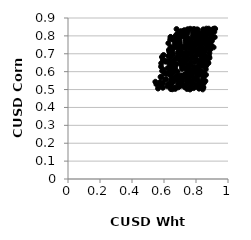
| Category | Series 0 |
|---|---|
| 0.8606674296195633 | 0.79 |
| 0.6999348493348481 | 0.739 |
| 0.7616677487825909 | 0.515 |
| 0.8411690088886075 | 0.803 |
| 0.8267198958037669 | 0.755 |
| 0.6464275884863512 | 0.652 |
| 0.6991743480333439 | 0.717 |
| 0.9055763534838281 | 0.791 |
| 0.6305321046207775 | 0.598 |
| 0.7493462155051412 | 0.692 |
| 0.7926615514258134 | 0.672 |
| 0.8619842693842257 | 0.634 |
| 0.8018020450109519 | 0.713 |
| 0.7681431878229723 | 0.595 |
| 0.7435577358216263 | 0.784 |
| 0.7680098271674152 | 0.583 |
| 0.8462123624348579 | 0.667 |
| 0.7551497769042917 | 0.541 |
| 0.8528021611921892 | 0.782 |
| 0.7980126099627312 | 0.597 |
| 0.7474657759232011 | 0.569 |
| 0.8227832912499451 | 0.809 |
| 0.7874615999468071 | 0.683 |
| 0.6772578194846646 | 0.576 |
| 0.8738030863500944 | 0.751 |
| 0.8219093014470423 | 0.516 |
| 0.7866721516052269 | 0.626 |
| 0.6597053665394986 | 0.649 |
| 0.6516592689620344 | 0.65 |
| 0.7657209606896632 | 0.644 |
| 0.8024218543053964 | 0.834 |
| 0.8706550780828108 | 0.741 |
| 0.669074520028345 | 0.622 |
| 0.8646617876156557 | 0.796 |
| 0.7603945457837402 | 0.754 |
| 0.6247156605005162 | 0.659 |
| 0.8823604310153959 | 0.808 |
| 0.6760753035382701 | 0.8 |
| 0.7093660823693577 | 0.579 |
| 0.8226724688563778 | 0.79 |
| 0.7941110131641931 | 0.617 |
| 0.7574359576495027 | 0.697 |
| 0.828742201009635 | 0.811 |
| 0.7875686067217196 | 0.559 |
| 0.7559894152250648 | 0.673 |
| 0.7127020296447344 | 0.636 |
| 0.8891551870113985 | 0.802 |
| 0.762055454840781 | 0.702 |
| 0.8590485811385213 | 0.683 |
| 0.7184461397085107 | 0.826 |
| 0.863336542518994 | 0.727 |
| 0.7287862776569984 | 0.584 |
| 0.7763459543036225 | 0.548 |
| 0.8511013413340252 | 0.591 |
| 0.7853879393883064 | 0.508 |
| 0.7261053649565652 | 0.521 |
| 0.8073128500880817 | 0.559 |
| 0.7706152322490856 | 0.727 |
| 0.8549010762931147 | 0.825 |
| 0.8164788701928894 | 0.641 |
| 0.7282324067350684 | 0.74 |
| 0.8453413548928314 | 0.82 |
| 0.7408618150149606 | 0.575 |
| 0.5826546042844745 | 0.647 |
| 0.5849590476056439 | 0.526 |
| 0.834208086383052 | 0.688 |
| 0.8829216560381401 | 0.778 |
| 0.7619245457397941 | 0.772 |
| 0.7424667995521614 | 0.786 |
| 0.63430194592752 | 0.658 |
| 0.8665952181532147 | 0.761 |
| 0.6363046175230376 | 0.623 |
| 0.8123294542023353 | 0.773 |
| 0.6272517796509438 | 0.759 |
| 0.7303868740352525 | 0.645 |
| 0.747805615586763 | 0.629 |
| 0.7387196085404604 | 0.748 |
| 0.8531141233221653 | 0.796 |
| 0.7000441003576795 | 0.52 |
| 0.7357308003392908 | 0.566 |
| 0.6686884077655872 | 0.509 |
| 0.886459890604691 | 0.788 |
| 0.7967532162745362 | 0.567 |
| 0.713061950828129 | 0.561 |
| 0.8450386710320554 | 0.572 |
| 0.650107749832884 | 0.568 |
| 0.8830811718809208 | 0.832 |
| 0.6908439687992156 | 0.577 |
| 0.7494634234757541 | 0.625 |
| 0.7966015069082593 | 0.715 |
| 0.6525941603431751 | 0.502 |
| 0.8988485349186075 | 0.771 |
| 0.7642685110995725 | 0.757 |
| 0.8048900127626286 | 0.835 |
| 0.7773979851258961 | 0.586 |
| 0.9141915747024514 | 0.822 |
| 0.6805559746553618 | 0.642 |
| 0.7753563499236906 | 0.724 |
| 0.7313395420374461 | 0.679 |
| 0.7403778849098179 | 0.733 |
| 0.6369871910606489 | 0.523 |
| 0.794139560420247 | 0.676 |
| 0.5459135540867835 | 0.543 |
| 0.8891057101044171 | 0.758 |
| 0.8570862290025462 | 0.714 |
| 0.8404834262172327 | 0.63 |
| 0.8190058497395645 | 0.79 |
| 0.7832564238110448 | 0.725 |
| 0.7670144380952288 | 0.636 |
| 0.6049131091752462 | 0.556 |
| 0.8841599138822888 | 0.677 |
| 0.769766131755828 | 0.763 |
| 0.7914323824373495 | 0.836 |
| 0.8394290192869471 | 0.719 |
| 0.900254879935451 | 0.783 |
| 0.7705790342479129 | 0.574 |
| 0.5785080369647733 | 0.522 |
| 0.7730563596486816 | 0.744 |
| 0.7109604963369003 | 0.569 |
| 0.7114264282506166 | 0.523 |
| 0.7945318887647026 | 0.606 |
| 0.7047854540880232 | 0.826 |
| 0.7987490666397192 | 0.555 |
| 0.657621811892098 | 0.697 |
| 0.7972365121890362 | 0.757 |
| 0.8160670857000676 | 0.799 |
| 0.8172476007302536 | 0.72 |
| 0.8645980398335521 | 0.827 |
| 0.6465674440631175 | 0.643 |
| 0.6473330996554859 | 0.639 |
| 0.69388869733561 | 0.763 |
| 0.822845698345114 | 0.734 |
| 0.6835287564256733 | 0.553 |
| 0.7262040441602107 | 0.828 |
| 0.7393463433897386 | 0.709 |
| 0.7431892750957874 | 0.82 |
| 0.7576750658893622 | 0.64 |
| 0.8205171400303991 | 0.703 |
| 0.8955819652153647 | 0.747 |
| 0.8456059353965881 | 0.758 |
| 0.8621538082955802 | 0.751 |
| 0.8574976041245859 | 0.637 |
| 0.7011321767333416 | 0.717 |
| 0.727032698446707 | 0.794 |
| 0.8115324630853016 | 0.715 |
| 0.7130231030299599 | 0.615 |
| 0.9100789554782126 | 0.736 |
| 0.8610060682945005 | 0.613 |
| 0.6461637803023965 | 0.53 |
| 0.5815749823376429 | 0.628 |
| 0.7684164012723802 | 0.61 |
| 0.57873007427408 | 0.571 |
| 0.6897111563245267 | 0.513 |
| 0.791592401936394 | 0.718 |
| 0.6381668285140478 | 0.645 |
| 0.7902167455943879 | 0.678 |
| 0.8214099296545454 | 0.789 |
| 0.841845915618669 | 0.501 |
| 0.8655235738521514 | 0.766 |
| 0.8470280653277532 | 0.8 |
| 0.6705704897241429 | 0.504 |
| 0.7714581741482851 | 0.776 |
| 0.6950713011940342 | 0.698 |
| 0.7634400294237285 | 0.777 |
| 0.8624804471045378 | 0.582 |
| 0.552539735679884 | 0.529 |
| 0.6047432097485013 | 0.662 |
| 0.8455813681659083 | 0.837 |
| 0.643227611150495 | 0.55 |
| 0.8653294060950341 | 0.84 |
| 0.7461143308959663 | 0.83 |
| 0.7656652444362569 | 0.728 |
| 0.846718511545769 | 0.705 |
| 0.7617597047274746 | 0.588 |
| 0.7111814085209395 | 0.815 |
| 0.8520275885324056 | 0.785 |
| 0.7711167658126614 | 0.54 |
| 0.6589163452898665 | 0.661 |
| 0.8876979161435098 | 0.723 |
| 0.7415588676593998 | 0.662 |
| 0.638925142293215 | 0.78 |
| 0.842803687995572 | 0.671 |
| 0.5927702129927285 | 0.51 |
| 0.8888104122212008 | 0.769 |
| 0.7506243877987404 | 0.762 |
| 0.8258061881006242 | 0.638 |
| 0.7126045932211109 | 0.551 |
| 0.8164320188498746 | 0.627 |
| 0.8816331317544839 | 0.767 |
| 0.7605180500470761 | 0.73 |
| 0.7689107483400326 | 0.605 |
| 0.5840231444493837 | 0.57 |
| 0.6778154042169096 | 0.572 |
| 0.7299447843663049 | 0.513 |
| 0.7433305532417129 | 0.581 |
| 0.6364237006245839 | 0.638 |
| 0.6215099641155544 | 0.619 |
| 0.6720542953454912 | 0.783 |
| 0.7782598846361921 | 0.799 |
| 0.8689872887404752 | 0.813 |
| 0.6974467133722992 | 0.765 |
| 0.6394360754973103 | 0.607 |
| 0.8635625449101264 | 0.75 |
| 0.810560085752624 | 0.612 |
| 0.8016937719703552 | 0.517 |
| 0.6568893812398542 | 0.542 |
| 0.7407771515292378 | 0.624 |
| 0.5760868745589425 | 0.542 |
| 0.8873434219742073 | 0.726 |
| 0.6512638997739032 | 0.712 |
| 0.6652056943328782 | 0.508 |
| 0.6767092164983124 | 0.768 |
| 0.8756846499300529 | 0.65 |
| 0.8209297307973322 | 0.599 |
| 0.8008426721371884 | 0.696 |
| 0.8641630802995725 | 0.825 |
| 0.771986340988601 | 0.51 |
| 0.7552100750282434 | 0.732 |
| 0.7126084199542722 | 0.627 |
| 0.8496559043590572 | 0.593 |
| 0.5934084951309078 | 0.535 |
| 0.8584434143177334 | 0.629 |
| 0.7466401838204122 | 0.704 |
| 0.8389305771052886 | 0.653 |
| 0.6411942763267084 | 0.794 |
| 0.8732103970196142 | 0.812 |
| 0.8233443501146176 | 0.71 |
| 0.5971302854120267 | 0.693 |
| 0.6420376646838131 | 0.792 |
| 0.827682074088159 | 0.689 |
| 0.7012180453999416 | 0.7 |
| 0.6882295356850916 | 0.531 |
| 0.6162200985139986 | 0.588 |
| 0.7931456751874846 | 0.746 |
| 0.6272098400817191 | 0.688 |
| 0.8351566433848229 | 0.602 |
| 0.6540176816289807 | 0.561 |
| 0.8536086110617027 | 0.549 |
| 0.8827212616734962 | 0.831 |
| 0.7895378014868231 | 0.789 |
| 0.8160166289097711 | 0.59 |
| 0.8732998928667913 | 0.768 |
| 0.8114623580518086 | 0.521 |
| 0.6050389218129978 | 0.594 |
| 0.6432901844368986 | 0.577 |
| 0.7687681902367982 | 0.544 |
| 0.7146784816566172 | 0.539 |
| 0.617539525077824 | 0.657 |
| 0.8188739694740013 | 0.505 |
| 0.6434206310784697 | 0.502 |
| 0.7919602599321796 | 0.742 |
| 0.6331478008929023 | 0.691 |
| 0.8189360760480737 | 0.534 |
| 0.6637279790685899 | 0.62 |
| 0.7519100591954112 | 0.829 |
| 0.6808461745985499 | 0.737 |
| 0.8506954751676822 | 0.538 |
| 0.7158261729020052 | 0.801 |
| 0.8812523412218833 | 0.811 |
| 0.8160749519391077 | 0.729 |
| 0.7884967793261731 | 0.836 |
| 0.8109143930961263 | 0.817 |
| 0.8181013925329039 | 0.58 |
| 0.8621398829910908 | 0.632 |
| 0.6970379652420732 | 0.537 |
| 0.7190223024847787 | 0.669 |
| 0.8428332807702796 | 0.657 |
| 0.8432223522655187 | 0.721 |
| 0.8367260831390656 | 0.714 |
| 0.8504165880620544 | 0.77 |
| 0.8012370942996936 | 0.716 |
| 0.738294205019498 | 0.617 |
| 0.8408728543970745 | 0.526 |
| 0.6913028649901257 | 0.781 |
| 0.8579816799352373 | 0.803 |
| 0.6670168252955941 | 0.614 |
| 0.8399845630766394 | 0.71 |
| 0.8861856365076313 | 0.808 |
| 0.6882287428264124 | 0.793 |
| 0.7261095750426819 | 0.832 |
| 0.7459321257994539 | 0.553 |
| 0.6970139019152364 | 0.564 |
| 0.7373628606863207 | 0.741 |
| 0.88455626767976 | 0.814 |
| 0.7836164829181484 | 0.597 |
| 0.6478032502909709 | 0.691 |
| 0.8124582857779081 | 0.699 |
| 0.8676851310975964 | 0.678 |
| 0.8123425496476344 | 0.589 |
| 0.754673587195449 | 0.545 |
| 0.6343893063387842 | 0.518 |
| 0.8414378532127648 | 0.556 |
| 0.8302352892545374 | 0.795 |
| 0.7100712161584233 | 0.649 |
| 0.7796773033210417 | 0.707 |
| 0.7695225444960228 | 0.672 |
| 0.7306427456611819 | 0.731 |
| 0.8003189563681707 | 0.528 |
| 0.907408295325438 | 0.83 |
| 0.6256235291805492 | 0.531 |
| 0.8162489379057041 | 0.616 |
| 0.8254555309737044 | 0.733 |
| 0.8616560084394712 | 0.681 |
| 0.6956451369858517 | 0.68 |
| 0.6212432720647237 | 0.518 |
| 0.720477365442941 | 0.821 |
| 0.7855729514309479 | 0.819 |
| 0.7637636017744206 | 0.84 |
| 0.7814882263432091 | 0.817 |
| 0.7459905355448025 | 0.813 |
| 0.7358517985887805 | 0.756 |
| 0.7688238770647915 | 0.706 |
| 0.842272771584692 | 0.652 |
| 0.7302664166692087 | 0.62 |
| 0.8461545169753178 | 0.512 |
| 0.844170841511323 | 0.514 |
| 0.8558165645070729 | 0.722 |
| 0.6756918324898885 | 0.798 |
| 0.8793673836888554 | 0.84 |
| 0.6697015563728509 | 0.602 |
| 0.7373575613773131 | 0.524 |
| 0.7338297327523413 | 0.772 |
| 0.691371620526104 | 0.723 |
| 0.8074120999186758 | 0.624 |
| 0.8077988816557793 | 0.58 |
| 0.7095622871951144 | 0.734 |
| 0.5728358254917891 | 0.535 |
| 0.7044281247054887 | 0.823 |
| 0.7824979367259741 | 0.761 |
| 0.8358422573948905 | 0.752 |
| 0.8836147786046735 | 0.704 |
| 0.7482022941452053 | 0.837 |
| 0.7623057017008482 | 0.501 |
| 0.8225426360062331 | 0.66 |
| 0.5930507305441419 | 0.666 |
| 0.7599118574750922 | 0.619 |
| 0.6308427904724045 | 0.721 |
| 0.7845202420389474 | 0.838 |
| 0.9053722029688596 | 0.829 |
| 0.6418973694429907 | 0.687 |
| 0.6100719539650808 | 0.656 |
| 0.7513478799309836 | 0.603 |
| 0.6933517373490123 | 0.578 |
| 0.7376611831939885 | 0.815 |
| 0.7434453143042599 | 0.504 |
| 0.7204320791972769 | 0.807 |
| 0.8066670010785599 | 0.834 |
| 0.6434577743966531 | 0.68 |
| 0.6980150477723515 | 0.76 |
| 0.744905515403242 | 0.55 |
| 0.7880729395410742 | 0.622 |
| 0.7361378238014964 | 0.646 |
| 0.8360929218424951 | 0.635 |
| 0.6484453032848716 | 0.608 |
| 0.8866137057355947 | 0.819 |
| 0.8019331473024236 | 0.778 |
| 0.6650036045078405 | 0.611 |
| 0.6962325599154053 | 0.694 |
| 0.7928297448203554 | 0.653 |
| 0.7898124238405653 | 0.606 |
| 0.8822482747321022 | 0.685 |
| 0.8028730310165905 | 0.802 |
| 0.658191332485484 | 0.729 |
| 0.7047466177103434 | 0.562 |
| 0.7480536045886679 | 0.77 |
| 0.715517951827609 | 0.803 |
| 0.5947877311453806 | 0.611 |
| 0.6858024636704033 | 0.706 |
| 0.7136596140645739 | 0.565 |
| 0.7961207807155652 | 0.749 |
| 0.8444600061460612 | 0.692 |
| 0.8743394994264134 | 0.828 |
| 0.7446216024779657 | 0.765 |
| 0.7099891387505436 | 0.643 |
| 0.9069599333466056 | 0.833 |
| 0.836795488901021 | 0.596 |
| 0.7525174033381757 | 0.676 |
| 0.7510028570557167 | 0.786 |
| 0.7193258204121296 | 0.806 |
| 0.6541839868776258 | 0.593 |
| 0.872896986666136 | 0.78 |
| 0.8433581901337426 | 0.674 |
| 0.833323076782873 | 0.668 |
| 0.6751179676581265 | 0.804 |
| 0.8483396610296318 | 0.573 |
| 0.8437210322174159 | 0.663 |
| 0.9012390827462435 | 0.822 |
| 0.8585504949483894 | 0.548 |
| 0.8510120033335822 | 0.775 |
| 0.9194648370120022 | 0.839 |
| 0.8474053975248491 | 0.809 |
| 0.8456537909505505 | 0.592 |
| 0.8771244551785382 | 0.647 |
| 0.8381008172166687 | 0.777 |
| 0.7406125934618681 | 0.754 |
| 0.7928154490153846 | 0.787 |
| 0.8209800229967568 | 0.764 |
| 0.6403085808956992 | 0.517 |
| 0.7827902294649498 | 0.536 |
| 0.7598837539863926 | 0.781 |
| 0.8518240353415665 | 0.775 |
| 0.8639974517395514 | 0.833 |
| 0.7330760248281251 | 0.655 |
| 0.8110676950247908 | 0.835 |
| 0.7776440490762082 | 0.686 |
| 0.887156787991738 | 0.766 |
| 0.7192929396571459 | 0.818 |
| 0.7769802574483803 | 0.754 |
| 0.7972150962828148 | 0.72 |
| 0.7143906212037885 | 0.668 |
| 0.7648619522165659 | 0.552 |
| 0.7048843219547547 | 0.744 |
| 0.588480018183968 | 0.604 |
| 0.7954755921440668 | 0.609 |
| 0.8320142247372411 | 0.739 |
| 0.8070732064053938 | 0.824 |
| 0.8154648838161828 | 0.726 |
| 0.9168791066861814 | 0.793 |
| 0.8454649617052246 | 0.821 |
| 0.7266859913749804 | 0.665 |
| 0.7900644041797736 | 0.805 |
| 0.6706492969897138 | 0.507 |
| 0.7255200053472541 | 0.696 |
| 0.7894816522489216 | 0.747 |
| 0.7429976671749301 | 0.547 |
| 0.5870163637829766 | 0.682 |
| 0.7720208843058256 | 0.525 |
| 0.6624426611995167 | 0.774 |
| 0.8728043854501029 | 0.76 |
| 0.7025828976432815 | 0.797 |
| 0.8609967691228757 | 0.671 |
| 0.6429583677941685 | 0.631 |
| 0.7416127455879985 | 0.831 |
| 0.7530693315505331 | 0.633 |
| 0.8442991067638911 | 0.827 |
| 0.8372617934690381 | 0.701 |
| 0.6933276740843215 | 0.784 |
| 0.8058727729384143 | 0.666 |
| 0.6703814946113574 | 0.669 |
| 0.7213331623919413 | 0.699 |
| 0.8910280880502676 | 0.798 |
| 0.6411084712254504 | 0.737 |
| 0.8143298448394103 | 0.816 |
| 0.7194363556164171 | 0.69 |
| 0.6138185248696718 | 0.558 |
| 0.7387586893795919 | 0.806 |
| 0.8442049988724978 | 0.787 |
| 0.6968606523427461 | 0.779 |
| 0.7181515564083577 | 0.633 |
| 0.7070734164161767 | 0.532 |
| 0.6718680601866465 | 0.56 |
| 0.771853121932835 | 0.694 |
| 0.5626353920811603 | 0.506 |
| 0.6658955000600157 | 0.749 |
| 0.9075158176961985 | 0.839 |
| 0.6385023435321047 | 0.584 |
| 0.8131902977208034 | 0.816 |
| 0.7691106939562756 | 0.654 |
| 0.6987520512703356 | 0.664 |
| 0.7505278971956673 | 0.774 |
| 0.8474921745575865 | 0.703 |
| 0.8355750631343921 | 0.54 |
| 0.8133706491991705 | 0.608 |
| 0.7797402582255332 | 0.614 |
| 0.8616905165206683 | 0.685 |
| 0.8347440914619624 | 0.533 |
| 0.9161142594718537 | 0.841 |
| 0.781087082239773 | 0.735 |
| 0.8326654531886902 | 0.743 |
| 0.749211119185095 | 0.6 |
| 0.7324775383770947 | 0.586 |
| 0.845114418180007 | 0.818 |
| 0.8674768130904551 | 0.659 |
| 0.8825468005825443 | 0.823 |
| 0.697797758133453 | 0.746 |
| 0.8707045738688799 | 0.745 |
| 0.6849056354397289 | 0.6 |
| 0.8386834437142767 | 0.709 |
| 0.6848424068489334 | 0.684 |
| 0.8091697740681953 | 0.771 |
| 0.7415007348585687 | 0.528 |
| 0.7980468678304317 | 0.557 |
| 0.7151596529411938 | 0.565 |
| 0.8161887267536658 | 0.546 |
| 0.8448166552464678 | 0.732 |
| 0.7118552771083579 | 0.708 |
| 0.894736558725845 | 0.811 |
| 0.8938141572880075 | 0.742 |
| 0.7635390377683873 | 0.738 |
| 0.6331560485504961 | 0.711 |
| 0.6985566285213716 | 0.806 |
| 0.6766555498901607 | 0.674 |
| 0.8908530128783441 | 0.81 |
| 0.8074035565970805 | 0.585 |
| 0.6049050308760262 | 0.591 |
| 0.6784215488501559 | 0.838 |
| 0.814353950755379 | 0.753 |
| 0.6848092788462434 | 0.813 |
| 0.9031988923091763 | 0.795 |
| 0.7848701350929661 | 0.563 |